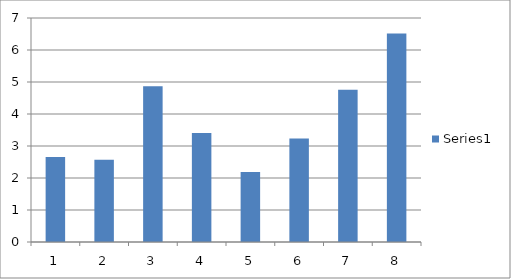
| Category | Series 0 |
|---|---|
| 0 | 2.658 |
| 1 | 2.568 |
| 2 | 4.865 |
| 3 | 3.405 |
| 4 | 2.189 |
| 5 | 3.234 |
| 6 | 4.757 |
| 7 | 6.514 |